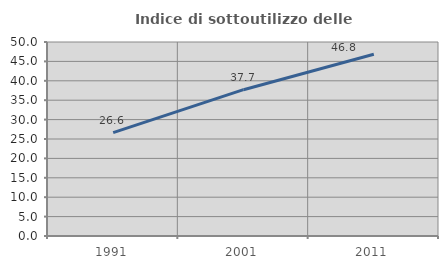
| Category | Indice di sottoutilizzo delle abitazioni  |
|---|---|
| 1991.0 | 26.63 |
| 2001.0 | 37.71 |
| 2011.0 | 46.841 |